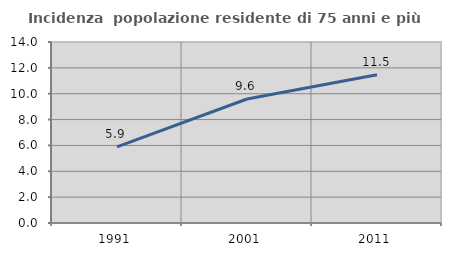
| Category | Incidenza  popolazione residente di 75 anni e più |
|---|---|
| 1991.0 | 5.894 |
| 2001.0 | 9.59 |
| 2011.0 | 11.46 |